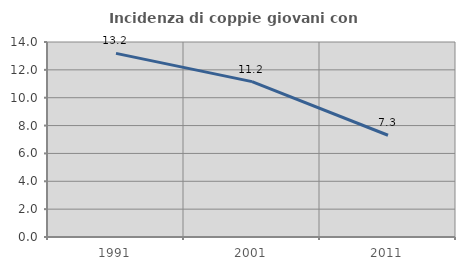
| Category | Incidenza di coppie giovani con figli |
|---|---|
| 1991.0 | 13.184 |
| 2001.0 | 11.155 |
| 2011.0 | 7.304 |